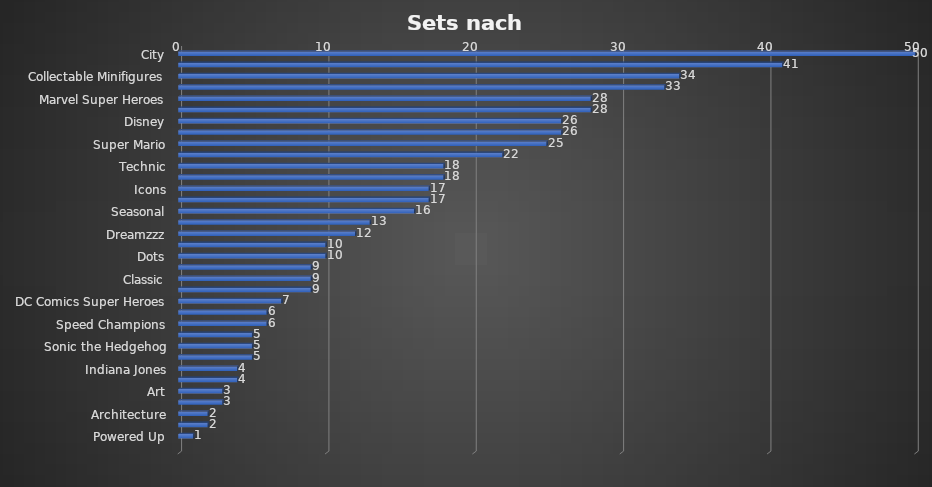
| Category | Sets |
|---|---|
| City | 50 |
| Friends | 41 |
| Collectable Minifigures | 34 |
| Star Wars | 33 |
| Marvel Super Heroes | 28 |
| Creator | 28 |
| Disney | 26 |
| Ninjago | 26 |
| Super Mario | 25 |
| Duplo | 22 |
| Technic | 18 |
| BrickHeadz | 18 |
| Icons | 17 |
| Harry Potter | 17 |
| Seasonal | 16 |
| Minecraft | 13 |
| Dreamzzz | 12 |
| Monkie Kid | 10 |
| Dots | 10 |
| Ideas | 9 |
| Classic | 9 |
| Promotional | 9 |
| DC Comics Super Heroes | 7 |
| Jurassic World | 6 |
| Speed Champions | 6 |
| Bricklink | 5 |
| Sonic the Hedgehog | 5 |
| Avatar | 5 |
| Indiana Jones | 4 |
| Gabby's Dollhouse | 4 |
| Art | 3 |
| Education | 3 |
| Architecture | 2 |
| LEGO Games | 2 |
| Powered Up | 1 |